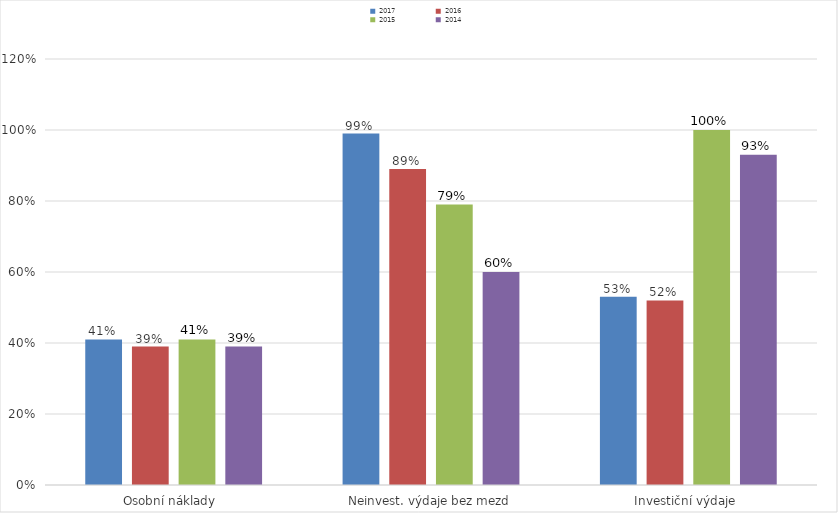
| Category | 2017 | 2016 | 2015 | 2014 |
|---|---|---|---|---|
| Osobní náklady  | 0.41 | 0.39 | 0.41 | 0.39 |
| Neinvest. výdaje bez mezd | 0.99 | 0.89 | 0.79 | 0.6 |
| Investiční výdaje  | 0.53 | 0.52 | 1 | 0.93 |